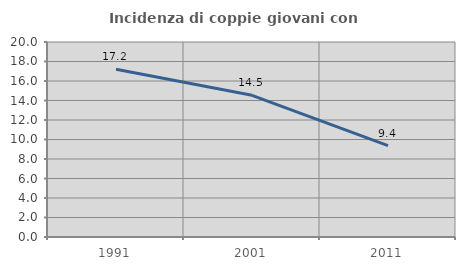
| Category | Incidenza di coppie giovani con figli |
|---|---|
| 1991.0 | 17.2 |
| 2001.0 | 14.533 |
| 2011.0 | 9.373 |